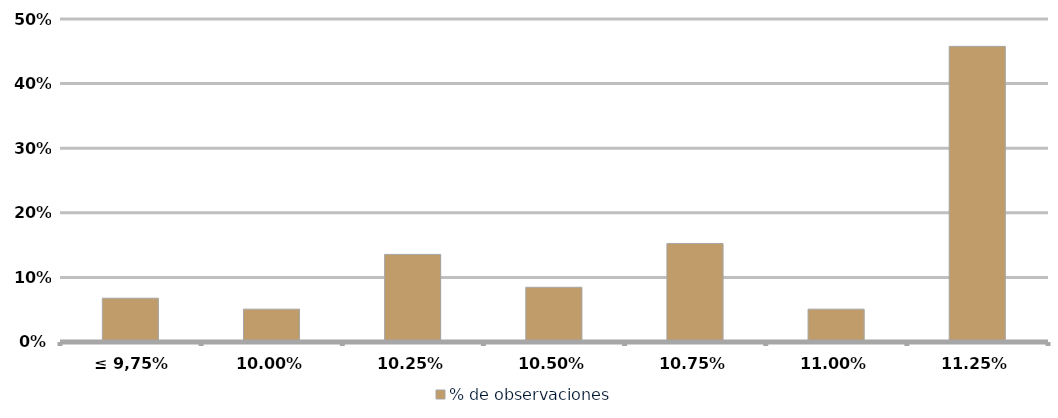
| Category | % de observaciones  |
|---|---|
| ≤ 9,75% | 0.068 |
| 10,00% | 0.051 |
| 10,25% | 0.136 |
| 10,50% | 0.085 |
| 10,75% | 0.153 |
| 11,00% | 0.051 |
| 11,25% | 0.458 |